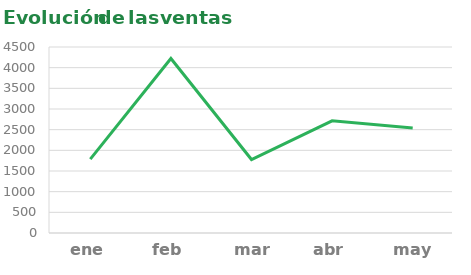
| Category | Sandalias |
|---|---|
| ene | 1787 |
| feb | 4222 |
| mar | 1777 |
| abr | 2715 |
| may | 2539 |